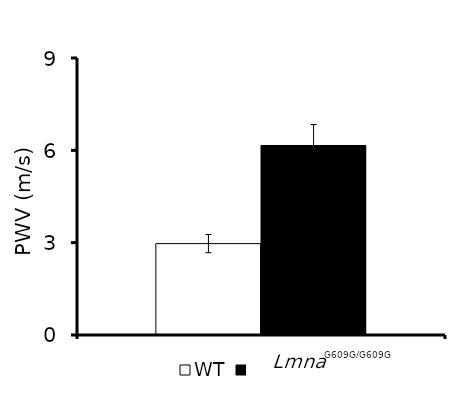
| Category | WT | Lmna |
|---|---|---|
| 0 | 2.969 | 6.157 |